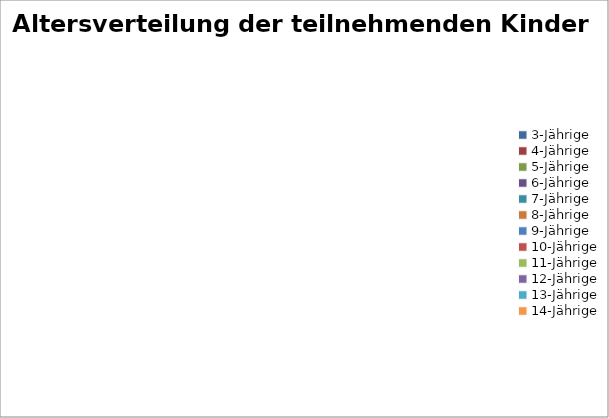
| Category | Series 0 |
|---|---|
| 3-Jährige | 0 |
| 4-Jährige | 0 |
| 5-Jährige | 0 |
| 6-Jährige | 0 |
| 7-Jährige | 0 |
| 8-Jährige | 0 |
| 9-Jährige | 0 |
| 10-Jährige | 0 |
| 11-Jährige | 0 |
| 12-Jährige | 0 |
| 13-Jährige | 0 |
| 14-Jährige | 0 |